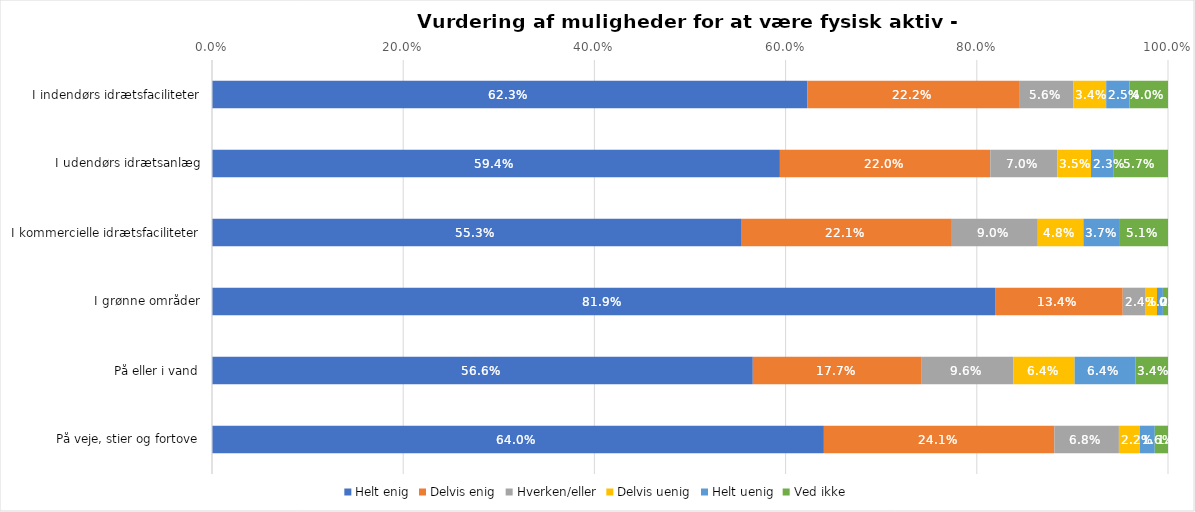
| Category | Helt enig | Delvis enig | Hverken/eller | Delvis uenig | Helt uenig | Ved ikke |
|---|---|---|---|---|---|---|
| I indendørs idrætsfaciliteter | 0.623 | 0.222 | 0.056 | 0.034 | 0.025 | 0.04 |
| I udendørs idrætsanlæg | 0.594 | 0.22 | 0.07 | 0.035 | 0.023 | 0.057 |
| I kommercielle idrætsfaciliteter | 0.553 | 0.221 | 0.09 | 0.048 | 0.037 | 0.051 |
| I grønne områder | 0.819 | 0.134 | 0.024 | 0.012 | 0.006 | 0.005 |
| På eller i vand | 0.566 | 0.177 | 0.096 | 0.064 | 0.064 | 0.034 |
| På veje, stier og fortove | 0.64 | 0.241 | 0.068 | 0.022 | 0.016 | 0.014 |